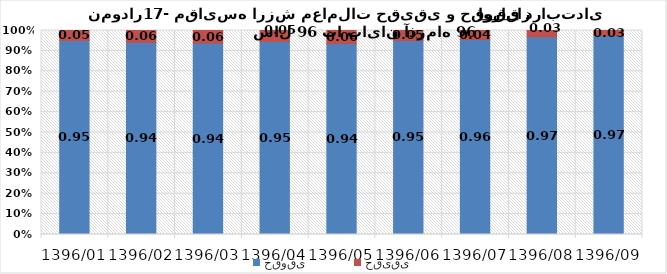
| Category | حقوقی | حقیقی |
|---|---|---|
| 1396/01 | 0.951 | 0.049 |
| 1396/02 | 0.942 | 0.058 |
| 1396/03 | 0.938 | 0.062 |
| 1396/04 | 0.946 | 0.054 |
| 1396/05 | 0.936 | 0.064 |
| 1396/06 | 0.951 | 0.049 |
| 1396/07 | 0.956 | 0.044 |
| 1396/08 | 0.969 | 0.031 |
| 1396/09 | 0.975 | 0.025 |